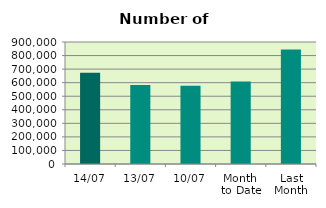
| Category | Series 0 |
|---|---|
| 14/07 | 673694 |
| 13/07 | 583584 |
| 10/07 | 576786 |
| Month 
to Date | 609038.2 |
| Last
Month | 844726.818 |